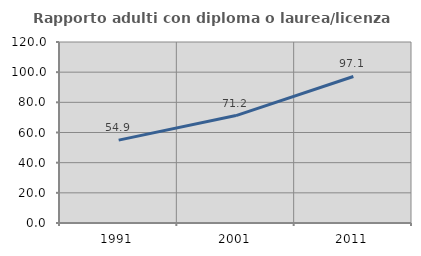
| Category | Rapporto adulti con diploma o laurea/licenza media  |
|---|---|
| 1991.0 | 54.935 |
| 2001.0 | 71.232 |
| 2011.0 | 97.128 |